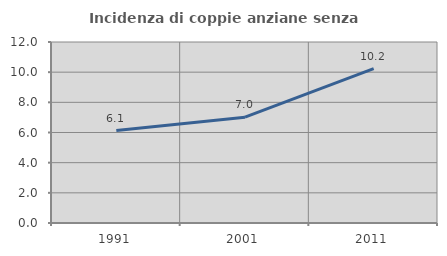
| Category | Incidenza di coppie anziane senza figli  |
|---|---|
| 1991.0 | 6.132 |
| 2001.0 | 7.018 |
| 2011.0 | 10.233 |